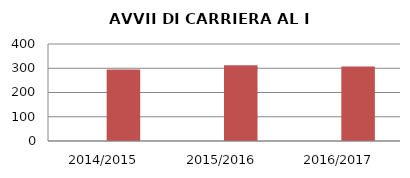
| Category | ANNO | NUMERO |
|---|---|---|
| 2014/2015 | 0 | 295 |
| 2015/2016 | 0 | 312 |
| 2016/2017 | 0 | 307 |